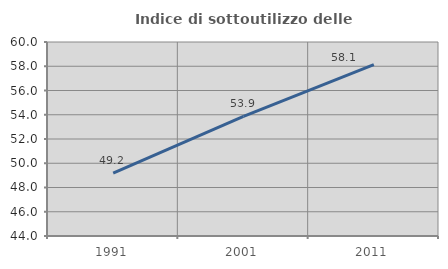
| Category | Indice di sottoutilizzo delle abitazioni  |
|---|---|
| 1991.0 | 49.18 |
| 2001.0 | 53.867 |
| 2011.0 | 58.14 |